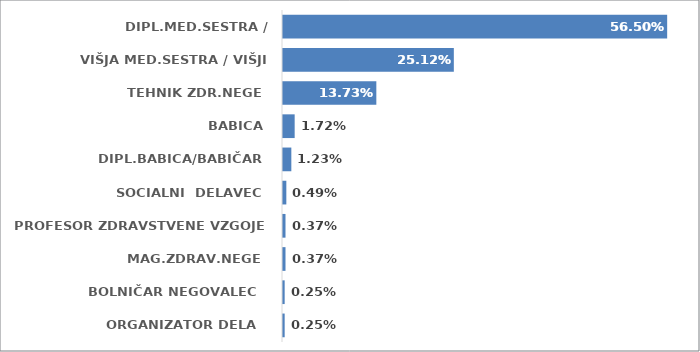
| Category | Series 0 |
|---|---|
| ORGANIZATOR DELA  | 0.002 |
| BOLNIČAR NEGOVALEC  | 0.002 |
| MAG.ZDRAV.NEGE | 0.004 |
| PROFESOR ZDRAVSTVENE VZGOJE  | 0.004 |
| SOCIALNI  DELAVEC | 0.005 |
| DIPL.BABICA/BABIČAR | 0.012 |
| BABICA | 0.017 |
| TEHNIK ZDR.NEGE | 0.137 |
| VIŠJA MED.SESTRA / VIŠJI ZDR.TEHNIK | 0.251 |
| DIPL.MED.SESTRA / ZDRAVSTVENIK | 0.565 |